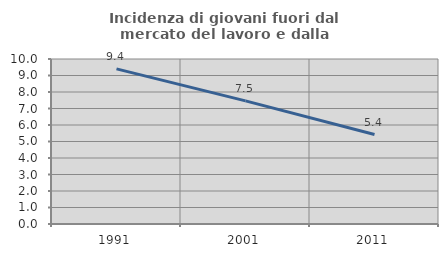
| Category | Incidenza di giovani fuori dal mercato del lavoro e dalla formazione  |
|---|---|
| 1991.0 | 9.399 |
| 2001.0 | 7.463 |
| 2011.0 | 5.424 |